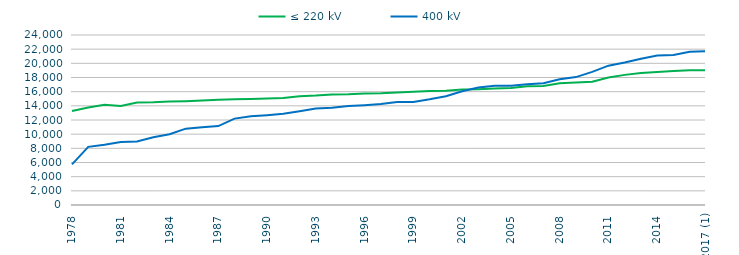
| Category | ≤ 220 kV | 400 kV |
|---|---|---|
| 1978 | 13258 | 5732 |
| 1979 | 13767 | 8207 |
| 1980 | 14139 | 8518 |
| 1981 | 13973 | 8906 |
| 1982 | 14466 | 8975 |
| 1983 | 14491 | 9563 |
| 1984 | 14598.3 | 9998 |
| 1985 | 14652.3 | 10781 |
| 1986 | 14746.3 | 10978 |
| 1987 | 14849.3 | 11147 |
| 1988 | 14938.3 | 12194 |
| 1989 | 14964.3 | 12533 |
| 1990 | 15034.5 | 12686 |
| 1991 | 15108.94 | 12883 |
| 1992 | 15356.14 | 13222 |
| 1993 | 15441.94 | 13611.17 |
| 1994 | 15585.94 | 13737.17 |
| 1995 | 15628.94 | 13969.73 |
| 1996 | 15733.54 | 14083.63 |
| 1997 | 15776.14 | 14243.65 |
| 1998 | 15875.92 | 14538.47 |
| 1999 | 15974.92 | 14538.47 |
| 2000 | 16077.74 | 14918 |
| 2001 | 16121.467 | 15364.269 |
| 2002 | 16296.158 | 16066.739 |
| 2003 | 16344.268 | 16592.459 |
| 2004 | 16464.172 | 16840.612 |
| 2005 | 16529.9 | 16845.694 |
| 2006 | 16752.829 | 17051.943 |
| 2007 | 16817.033 | 17190.606 |
| 2008 | 17174.804 | 17764.621 |
| 2009 | 17307.192 | 18056.47 |
| 2010 | 17400.504 | 18792.423 |
| 2011 | 18000.768 | 19671.35 |
| 2012 | 18369.641 | 20108.846 |
| 2013 | 18642.941 | 20639.478 |
| 2014 | 18782.059 | 21093.512 |
| 2015 | 18922.362 | 21183.826 |
| 2016 | 19010.339 | 21618.968 |
| 2017 (1) | 19038.66 | 21728.155 |